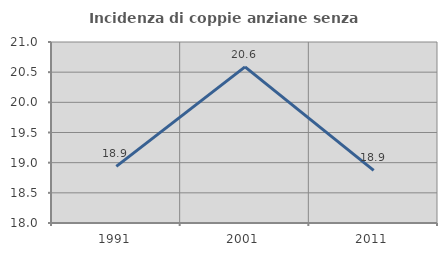
| Category | Incidenza di coppie anziane senza figli  |
|---|---|
| 1991.0 | 18.938 |
| 2001.0 | 20.588 |
| 2011.0 | 18.873 |